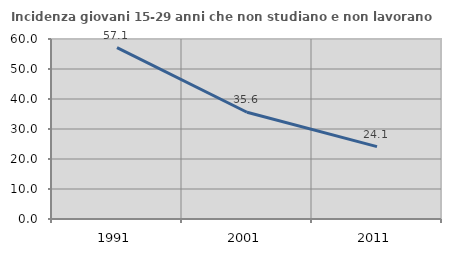
| Category | Incidenza giovani 15-29 anni che non studiano e non lavorano  |
|---|---|
| 1991.0 | 57.127 |
| 2001.0 | 35.583 |
| 2011.0 | 24.138 |